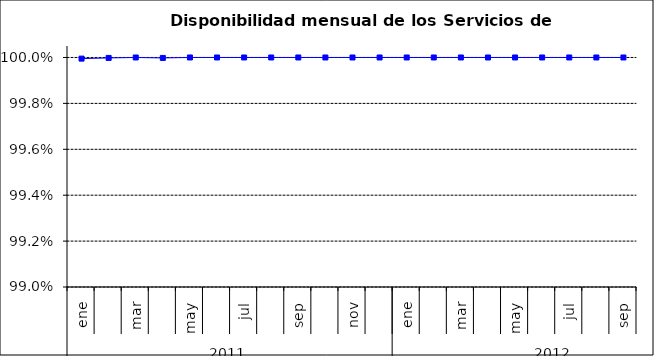
| Category | SCL |
|---|---|
| 0 | 1 |
| 1 | 1 |
| 2 | 1 |
| 3 | 1 |
| 4 | 1 |
| 5 | 1 |
| 6 | 1 |
| 7 | 1 |
| 8 | 1 |
| 9 | 1 |
| 10 | 1 |
| 11 | 1 |
| 12 | 1 |
| 13 | 1 |
| 14 | 1 |
| 15 | 1 |
| 16 | 1 |
| 17 | 1 |
| 18 | 1 |
| 19 | 1 |
| 20 | 1 |